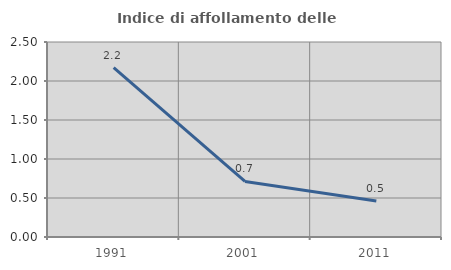
| Category | Indice di affollamento delle abitazioni  |
|---|---|
| 1991.0 | 2.171 |
| 2001.0 | 0.712 |
| 2011.0 | 0.462 |